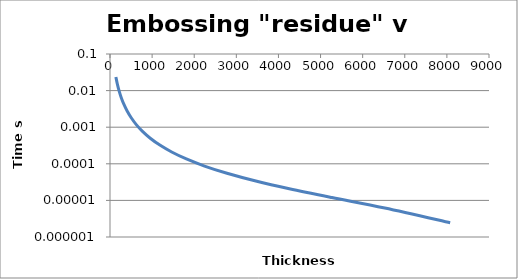
| Category | Series 0 |
|---|---|
| 8078.047485729404 | 0 |
| 6525.485118169914 | 0 |
| 5271.317865199711 | 0 |
| 4258.195602745702 | 0 |
| 3439.790628250392 | 0 |
| 2778.6792035973644 | 0 |
| 2244.6302554268273 | 0 |
| 1813.222979124283 | 0 |
| 1464.7301327581695 | 0 |
| 1183.2159566199227 | 0 |
| 955.8074683448478 | 0 |
| 772.1058116504485 | 0.001 |
| 623.7107410519966 | 0.001 |
| 503.83649835775043 | 0.002 |
| 407.00151587775326 | 0.003 |
| 328.7777572024341 | 0.004 |
| 265.58823349328753 | 0.007 |
| 214.54343618097653 | 0.01 |
| 173.30920652214843 | 0.015 |
| 139.99999999999991 | 0.023 |